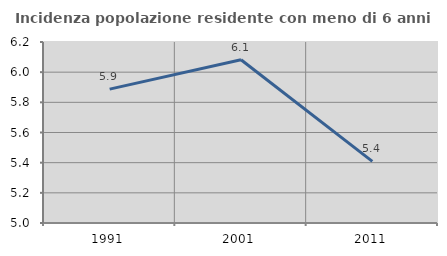
| Category | Incidenza popolazione residente con meno di 6 anni |
|---|---|
| 1991.0 | 5.887 |
| 2001.0 | 6.082 |
| 2011.0 | 5.408 |